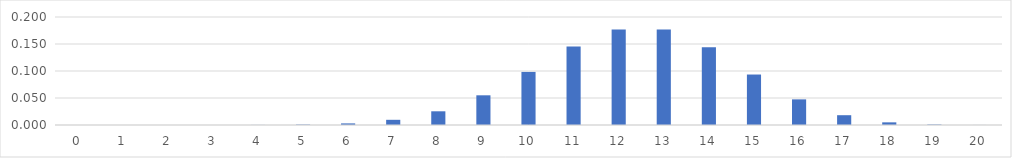
| Category | Series 0 |
|---|---|
| 0.0 | 0 |
| 1.0 | 0 |
| 2.0 | 0 |
| 3.0 | 0 |
| 4.0 | 0 |
| 5.0 | 0.001 |
| 6.0 | 0.003 |
| 7.0 | 0.01 |
| 8.0 | 0.025 |
| 9.0 | 0.055 |
| 10.0 | 0.098 |
| 11.0 | 0.145 |
| 12.0 | 0.177 |
| 13.0 | 0.177 |
| 14.0 | 0.144 |
| 15.0 | 0.093 |
| 16.0 | 0.047 |
| 17.0 | 0.018 |
| 18.0 | 0.005 |
| 19.0 | 0.001 |
| 20.0 | 0 |